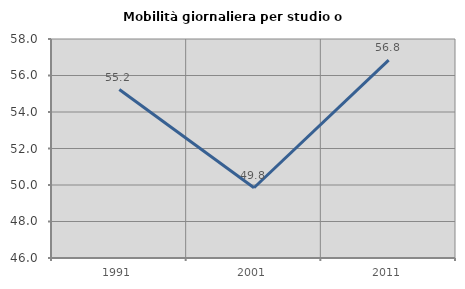
| Category | Mobilità giornaliera per studio o lavoro |
|---|---|
| 1991.0 | 55.231 |
| 2001.0 | 49.85 |
| 2011.0 | 56.842 |